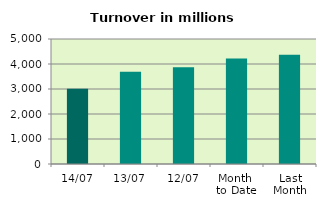
| Category | Series 0 |
|---|---|
| 14/07 | 3007.604 |
| 13/07 | 3687.403 |
| 12/07 | 3872.343 |
| Month 
to Date | 4216.267 |
| Last
Month | 4366.67 |